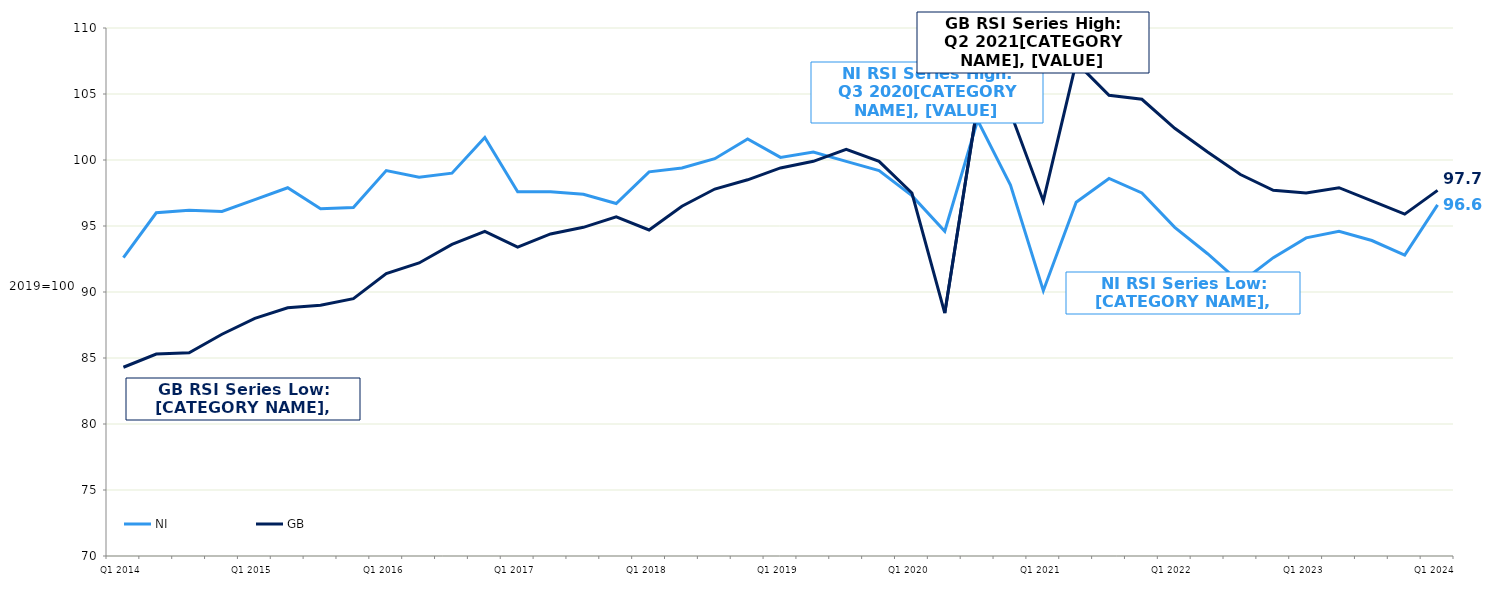
| Category | NI | GB  |
|---|---|---|
| Q1 2014 | 92.6 | 84.3 |
|  | 96 | 85.3 |
|  | 96.2 | 85.4 |
|  | 96.1 | 86.8 |
| Q1 2015 | 97 | 88 |
|  | 97.9 | 88.8 |
|  | 96.3 | 89 |
|  | 96.4 | 89.5 |
| Q1 2016 | 99.2 | 91.4 |
|  | 98.7 | 92.2 |
|  | 99 | 93.6 |
|  | 101.7 | 94.6 |
| Q1 2017 | 97.6 | 93.4 |
|  | 97.6 | 94.4 |
|  | 97.4 | 94.9 |
|  | 96.7 | 95.7 |
| Q1 2018 | 99.1 | 94.7 |
|  | 99.4 | 96.5 |
|  | 100.1 | 97.8 |
|  | 101.6 | 98.5 |
| Q1 2019 | 100.2 | 99.4 |
|  | 100.6 | 99.9 |
|  | 99.9 | 100.8 |
|  | 99.2 | 99.9 |
| Q1 2020 | 97.3 | 97.5 |
|  | 94.6 | 88.4 |
|  | 103 | 104.2 |
|  | 98.1 | 103.6 |
| Q1 2021 | 90.1 | 96.9 |
|  | 96.8 | 107.4 |
|  | 98.6 | 104.9 |
|  | 97.5 | 104.6 |
| Q1 2022 | 94.9 | 102.4 |
|  | 92.9 | 100.6 |
|  | 90.7 | 98.9 |
|  | 92.6 | 97.7 |
| Q1 2023 | 94.1 | 97.5 |
|  | 94.6 | 97.9 |
|  | 93.9 | 96.9 |
|  | 92.8 | 95.9 |
| Q1 2024 | 96.6 | 97.7 |